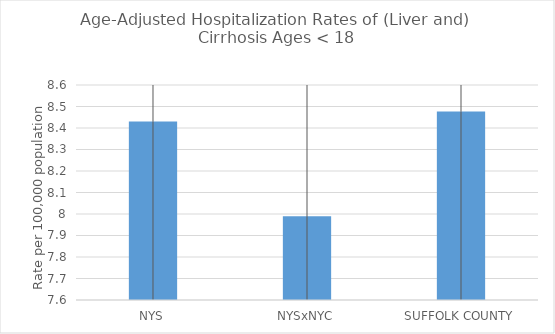
| Category | Age-Adjusted Hospitalization Rates of (Liver and) Cirrhosis Ages < 18 |
|---|---|
| NYS | 8.43 |
| NYSxNYC | 7.99 |
| SUFFOLK COUNTY | 8.476 |